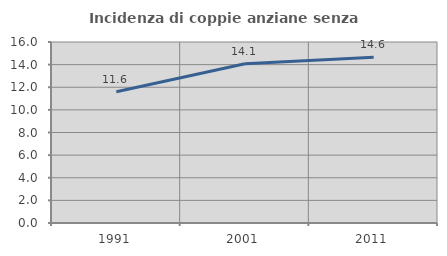
| Category | Incidenza di coppie anziane senza figli  |
|---|---|
| 1991.0 | 11.598 |
| 2001.0 | 14.07 |
| 2011.0 | 14.646 |